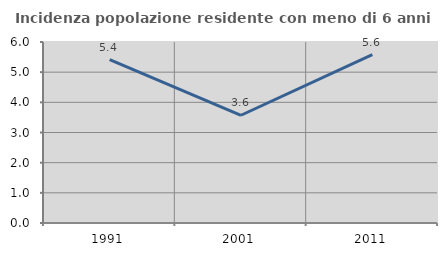
| Category | Incidenza popolazione residente con meno di 6 anni |
|---|---|
| 1991.0 | 5.414 |
| 2001.0 | 3.571 |
| 2011.0 | 5.585 |